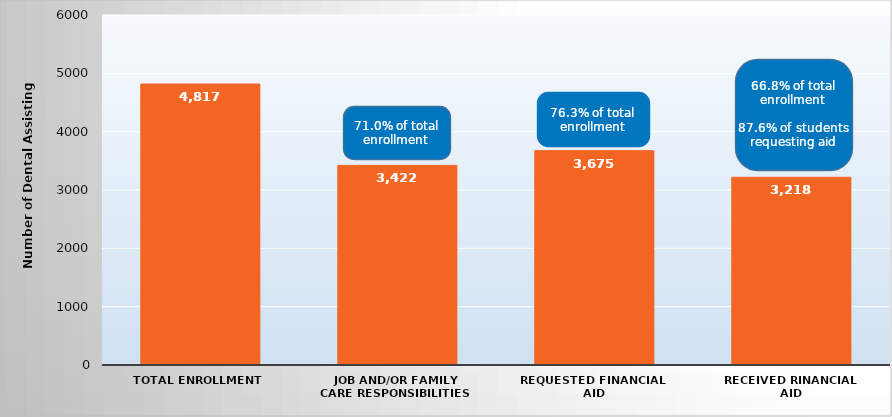
| Category | number of dental assisting students |
|---|---|
| Total Enrollment | 4817 |
| Job and/or Family Care Responsibilities | 3422 |
| Requested Financial Aid | 3675 |
| Received Rinancial Aid | 3218 |